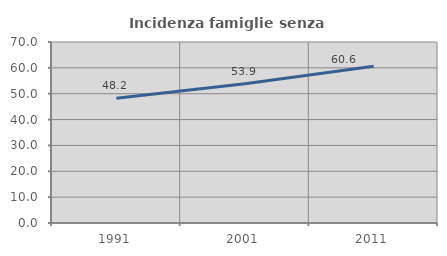
| Category | Incidenza famiglie senza nuclei |
|---|---|
| 1991.0 | 48.223 |
| 2001.0 | 53.889 |
| 2011.0 | 60.606 |